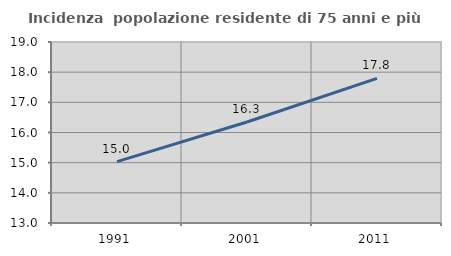
| Category | Incidenza  popolazione residente di 75 anni e più |
|---|---|
| 1991.0 | 15.035 |
| 2001.0 | 16.348 |
| 2011.0 | 17.792 |